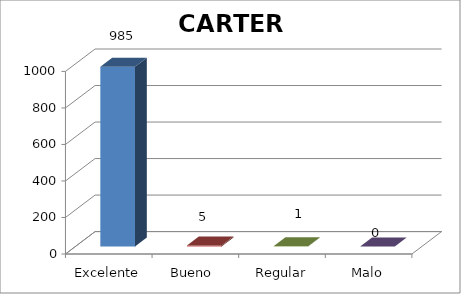
| Category | Series 0 |
|---|---|
| Excelente | 985 |
| Bueno  | 5 |
| Regular | 1 |
| Malo | 0 |